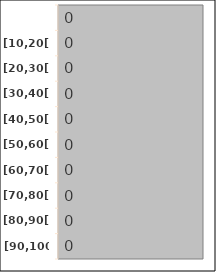
| Category | Series 0 |
|---|---|
|  | 0 |
| [10,20[ | 0 |
| [20,30[ | 0 |
| [30,40[ | 0 |
| [40,50[ | 0 |
| [50,60[ | 0 |
| [60,70[ | 0 |
| [70,80[ | 0 |
| [80,90[ | 0 |
| [90,100] | 0 |